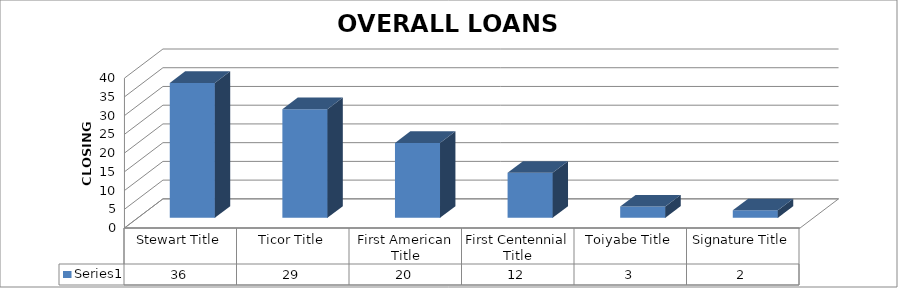
| Category | Series 0 |
|---|---|
| Stewart Title | 36 |
| Ticor Title | 29 |
| First American Title | 20 |
| First Centennial Title | 12 |
| Toiyabe Title | 3 |
| Signature Title | 2 |